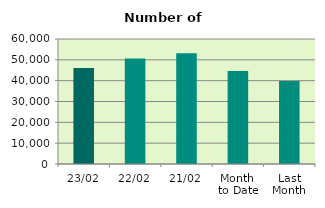
| Category | Series 0 |
|---|---|
| 23/02 | 46054 |
| 22/02 | 50650 |
| 21/02 | 53162 |
| Month 
to Date | 44642.824 |
| Last
Month | 39786.667 |